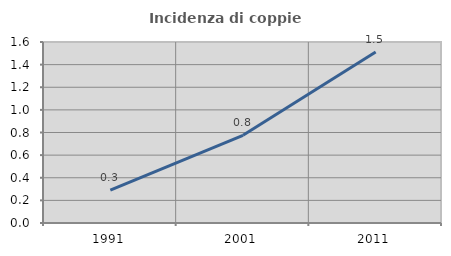
| Category | Incidenza di coppie miste |
|---|---|
| 1991.0 | 0.291 |
| 2001.0 | 0.775 |
| 2011.0 | 1.511 |